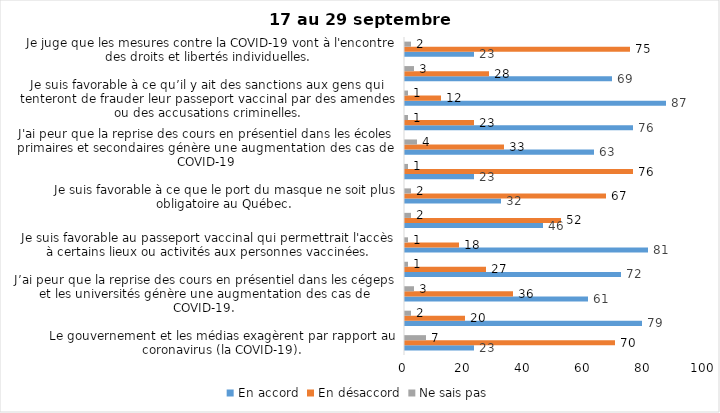
| Category | En accord | En désaccord | Ne sais pas |
|---|---|---|---|
| Le gouvernement et les médias exagèrent par rapport au coronavirus (la COVID-19). | 23 | 70 | 7 |
| J’ai peur que le système de santé soit débordé par les cas de COVID-19. | 79 | 20 | 2 |
| J’ai peur que la reprise des cours en présentiel dans les cégeps et les universités génère une augmentation des cas de COVID-19. | 61 | 36 | 3 |
| Je suis inquiet/inquiète  que le nombre de cas augmente en raison des nouveaux variants du virus de la COVID-19 | 72 | 27 | 1 |
| Je suis favorable au passeport vaccinal qui permettrait l'accès à certains lieux ou activités aux personnes vaccinées. | 81 | 18 | 1 |
| Si les cas de COVID-19 augmentent cet automne, je suis favorable à la mise en place de mesures de confinement (ex. fermeture de services non essentiels, interdiction des rassemblements privés) | 46 | 52 | 2 |
| Je suis favorable à ce que le port du masque ne soit plus obligatoire au Québec. | 32 | 67 | 2 |
| Étant donné la progression de la vaccination, je pense qu’il est moins important de suivre les mesures de prévention. | 23 | 76 | 1 |
| J'ai peur que la reprise des cours en présentiel dans les écoles primaires et secondaires génère une augmentation des cas de COVID-19 | 63 | 33 | 4 |
| Je suis favorable à ce qu’il y ait des sanctions aux commerçants qui ne vérifieront pas le passeport vaccinal (code QR) de leurs clients | 76 | 23 | 1 |
| Je suis favorable à ce qu’il y ait des sanctions aux gens qui tenteront de frauder leur passeport vaccinal par des amendes ou des accusations criminelles. | 87 | 12 | 1 |
| Je crois que le passeport vaccinal devrait être requis pour davantage de services et commerces (ex. : spas, centre d’achats, centre de soins personnels. | 69 | 28 | 3 |
| Je juge que les mesures contre la COVID-19 vont à l'encontre des droits et libertés individuelles.  | 23 | 75 | 2 |